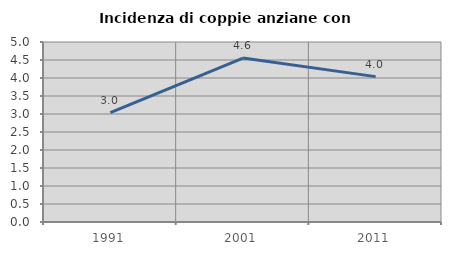
| Category | Incidenza di coppie anziane con figli |
|---|---|
| 1991.0 | 3.036 |
| 2001.0 | 4.555 |
| 2011.0 | 4.038 |